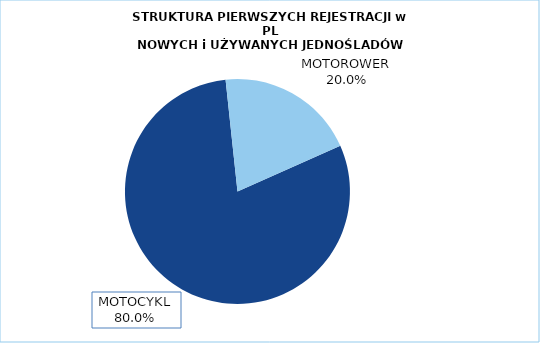
| Category | RAZEM |
|---|---|
|  MOTOCYKL  | 0.8 |
|  MOTOROWER  | 0.2 |